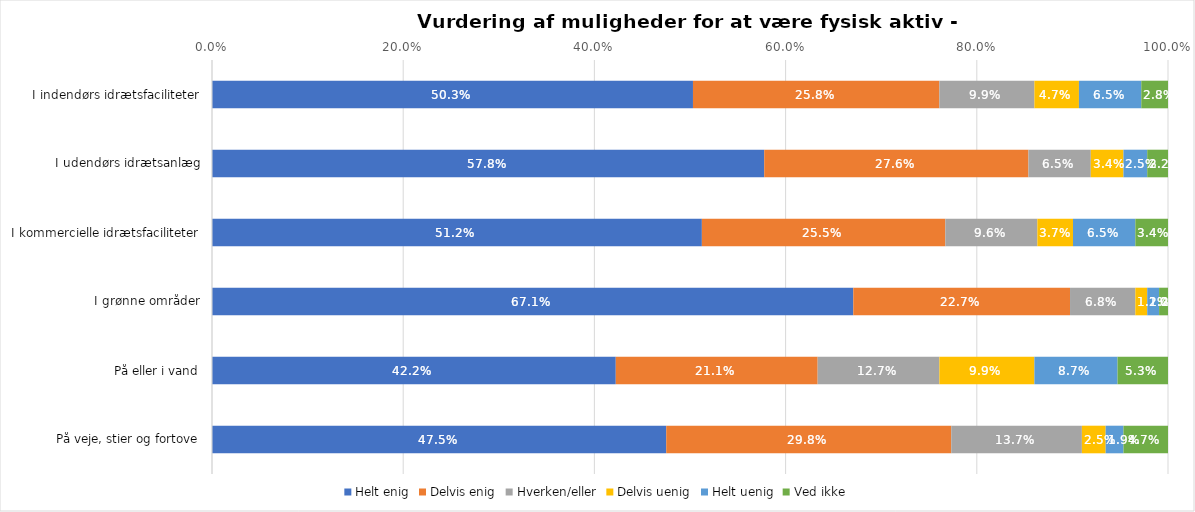
| Category | Helt enig | Delvis enig | Hverken/eller | Delvis uenig | Helt uenig | Ved ikke |
|---|---|---|---|---|---|---|
| I indendørs idrætsfaciliteter | 0.503 | 0.258 | 0.099 | 0.047 | 0.065 | 0.028 |
| I udendørs idrætsanlæg | 0.578 | 0.276 | 0.065 | 0.034 | 0.025 | 0.022 |
| I kommercielle idrætsfaciliteter | 0.512 | 0.255 | 0.096 | 0.037 | 0.065 | 0.034 |
| I grønne områder | 0.671 | 0.227 | 0.068 | 0.012 | 0.012 | 0.009 |
| På eller i vand | 0.422 | 0.211 | 0.127 | 0.099 | 0.087 | 0.053 |
| På veje, stier og fortove | 0.475 | 0.298 | 0.137 | 0.025 | 0.019 | 0.047 |